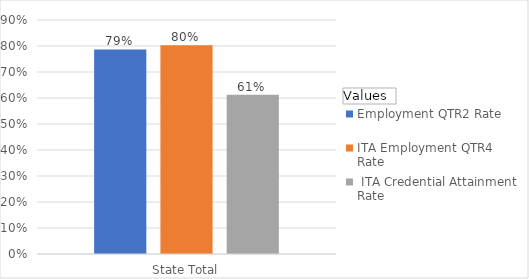
| Category | Employment QTR2 Rate  | ITA Employment QTR4 Rate  |  ITA Credential Attainment Rate  |
|---|---|---|---|
| State Total | 0.787 | 0.803 | 0.612 |